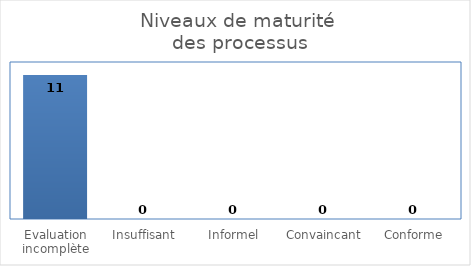
| Category | Niveaux de maturité
 des processus |
|---|---|
| Evaluation incomplète | 11 |
| Insuffisant | 0 |
| Informel | 0 |
| Convaincant | 0 |
| Conforme | 0 |